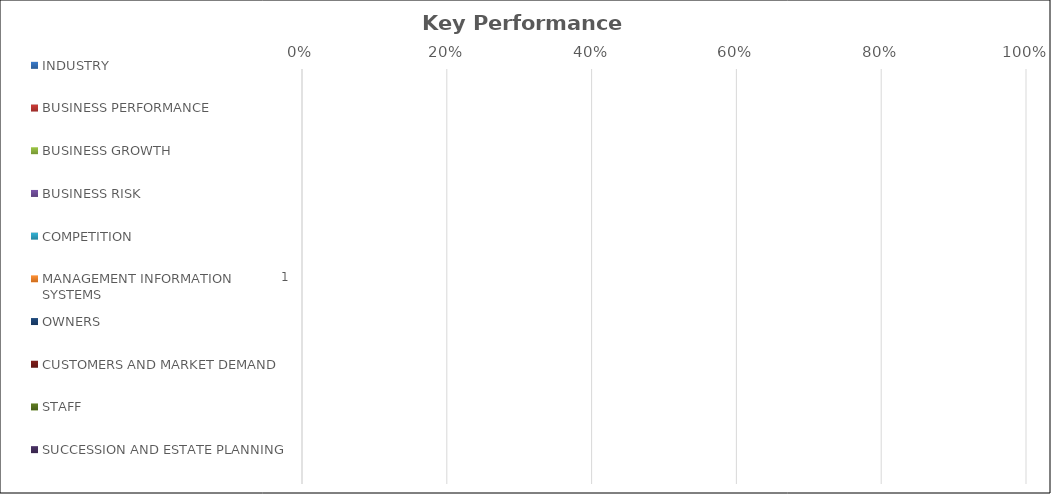
| Category | INDUSTRY | BUSINESS PERFORMANCE | BUSINESS GROWTH | BUSINESS RISK | COMPETITION | MANAGEMENT INFORMATION SYSTEMS | OWNERS | CUSTOMERS AND MARKET DEMAND | STAFF | SUCCESSION AND ESTATE PLANNING |
|---|---|---|---|---|---|---|---|---|---|---|
| 0 | 0 | 0 | 0 | 0 | 0 | 0 | 0 | 0 | 0 | 0 |